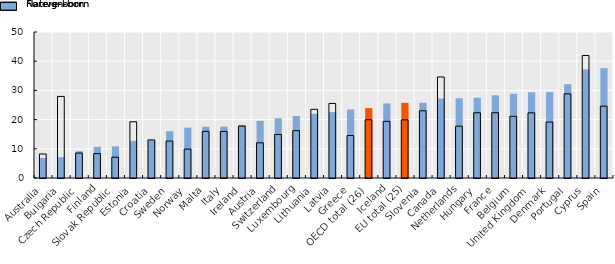
| Category | Foreign-born | Native-born |
|---|---|---|
| Australia | 6.817 | 8.22 |
| Bulgaria | 7.166 | 27.938 |
| Czech Republic | 9.201 | 8.542 |
| Finland | 10.681 | 8.35 |
| Slovak Republic | 10.826 | 7.108 |
| Estonia | 12.711 | 19.246 |
| Croatia | 12.897 | 13.044 |
| Sweden | 16.015 | 12.645 |
| Norway | 17.239 | 9.899 |
| Malta | 17.544 | 15.968 |
| Italy | 17.605 | 15.947 |
| Ireland | 18.176 | 17.757 |
| Austria | 19.568 | 12.053 |
| Switzerland | 20.439 | 14.898 |
| Luxembourg | 21.262 | 16.198 |
| Lithuania | 22.01 | 23.52 |
| Latvia | 22.568 | 25.535 |
| Greece | 23.469 | 14.544 |
| OECD total (26) | 23.929 | 19.943 |
| Iceland | 25.544 | 19.41 |
| EU total (25) | 25.748 | 19.913 |
| Slovenia | 25.775 | 23.016 |
| Canada | 27.228 | 34.603 |
| Netherlands | 27.316 | 17.759 |
| Hungary | 27.496 | 22.347 |
| France | 28.342 | 22.365 |
| Belgium | 28.872 | 21.123 |
| United Kingdom | 29.374 | 22.316 |
| Denmark | 29.399 | 19.16 |
| Portugal | 32.129 | 28.811 |
| Cyprus | 37.189 | 41.959 |
| Spain | 37.637 | 24.598 |